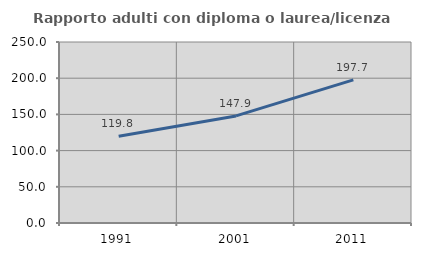
| Category | Rapporto adulti con diploma o laurea/licenza media  |
|---|---|
| 1991.0 | 119.789 |
| 2001.0 | 147.888 |
| 2011.0 | 197.744 |